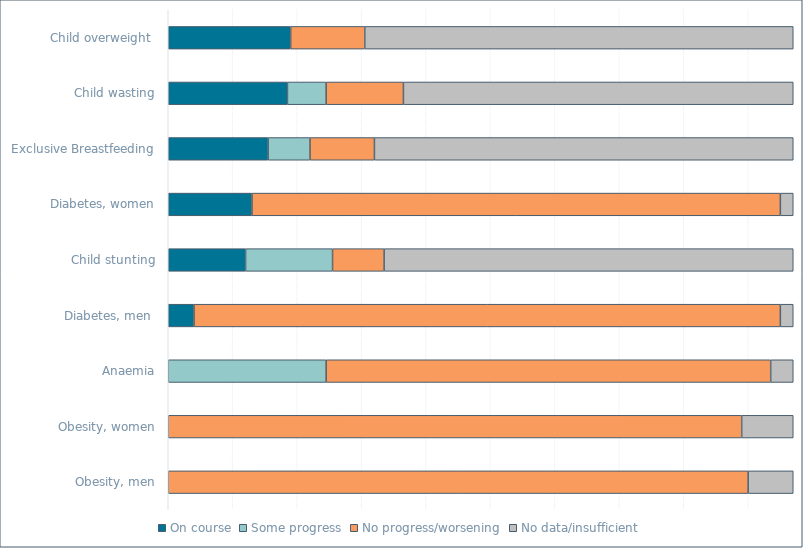
| Category | On course | Some progress | No progress/worsening | No data/insufficient |
|---|---|---|---|---|
| Obesity, men | 0 | 0 | 180 | 14 |
| Obesity, women | 0 | 0 | 178 | 16 |
| Anaemia | 0 | 49 | 138 | 7 |
| Diabetes, men  | 8 | 0 | 182 | 4 |
| Child stunting | 24 | 27 | 16 | 127 |
| Diabetes, women | 26 | 0 | 164 | 4 |
| Exclusive Breastfeeding | 31 | 13 | 20 | 130 |
| Child wasting | 37 | 12 | 24 | 121 |
| Child overweight  | 38 | 0 | 23 | 133 |